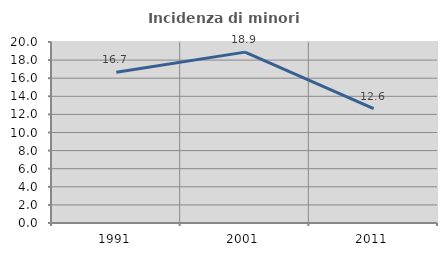
| Category | Incidenza di minori stranieri |
|---|---|
| 1991.0 | 16.667 |
| 2001.0 | 18.881 |
| 2011.0 | 12.639 |